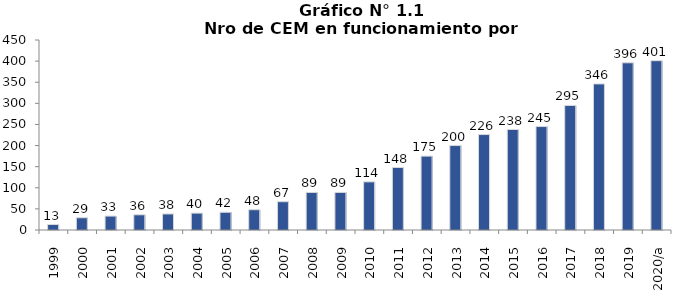
| Category | Series 0 |
|---|---|
| 1999 | 13 |
| 2000 | 29 |
| 2001 | 33 |
| 2002 | 36 |
| 2003 | 38 |
| 2004 | 40 |
| 2005 | 42 |
| 2006 | 48 |
| 2007 | 67 |
| 2008 | 89 |
| 2009 | 89 |
| 2010 | 114 |
| 2011 | 148 |
| 2012 | 175 |
| 2013 | 200 |
| 2014 | 226 |
| 2015 | 238 |
| 2016 | 245 |
| 2017 | 295 |
| 2018 | 346 |
| 2019 | 396 |
| 2020/a | 401 |